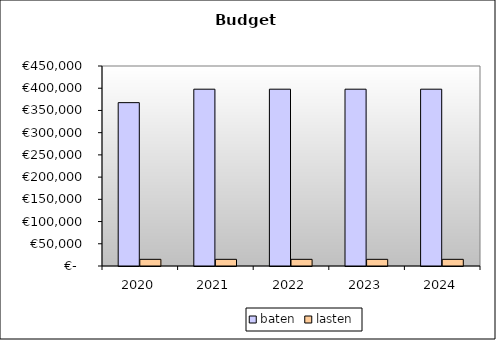
| Category | baten | lasten |
|---|---|---|
| 2020.0 | 367543.25 | 15000 |
| 2021.0 | 397794 | 15000 |
| 2022.0 | 397794 | 15000 |
| 2023.0 | 397794 | 15000 |
| 2024.0 | 397794 | 15000 |